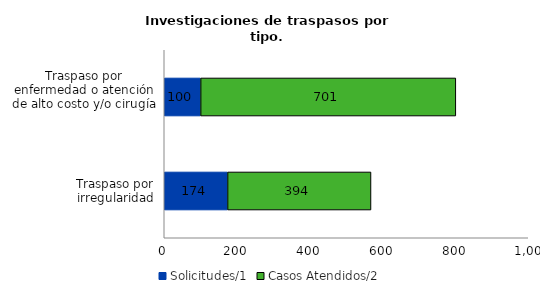
| Category |  Solicitudes/1 | Casos Atendidos/2 |
|---|---|---|
| Traspaso por enfermedad o atención de alto costo y/o cirugía | 100 | 701 |
| Traspaso por irregularidad | 174 | 394 |